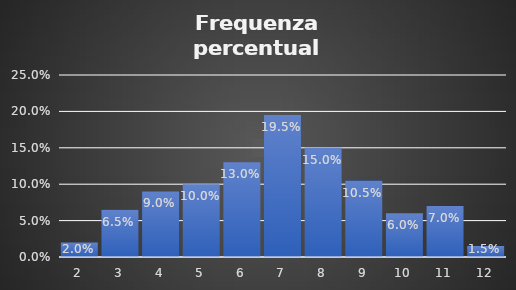
| Category | Frequenza
percentuale |
|---|---|
| 2.0 | 0.02 |
| 3.0 | 0.065 |
| 4.0 | 0.09 |
| 5.0 | 0.1 |
| 6.0 | 0.13 |
| 7.0 | 0.195 |
| 8.0 | 0.15 |
| 9.0 | 0.105 |
| 10.0 | 0.06 |
| 11.0 | 0.07 |
| 12.0 | 0.015 |